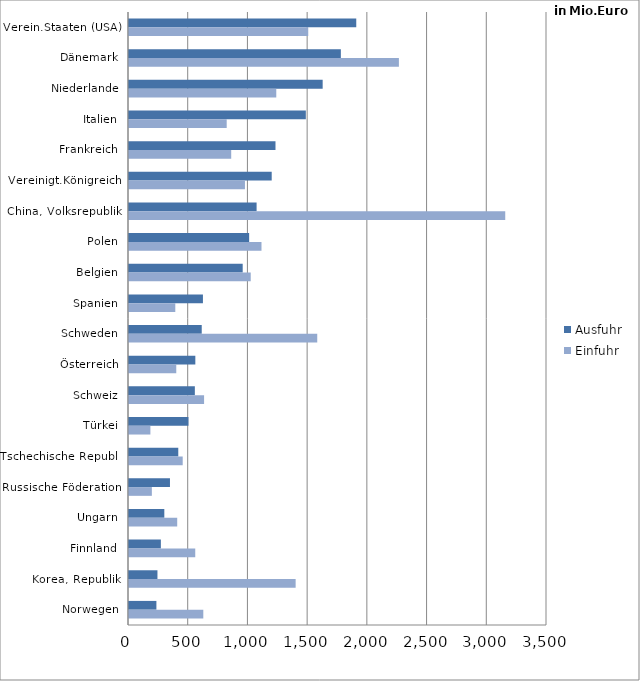
| Category | Ausfuhr | Einfuhr |
|---|---|---|
| Verein.Staaten (USA) | 1902.893 | 1500.786 |
| Dänemark | 1773.91 | 2259.923 |
| Niederlande | 1621.59 | 1233.15 |
| Italien | 1480.659 | 818.04 |
| Frankreich | 1226.59 | 855.825 |
| Vereinigt.Königreich | 1194.891 | 970.867 |
| China, Volksrepublik | 1068.472 | 3150.347 |
| Polen | 1006.036 | 1109.371 |
| Belgien | 952.022 | 1019.23 |
| Spanien | 619.037 | 387.643 |
| Schweden | 609.028 | 1576.155 |
| Österreich | 555.416 | 395.746 |
| Schweiz | 551.377 | 628.663 |
| Türkei | 497.971 | 179.114 |
| Tschechische Republ. | 412.59 | 449.705 |
| Russische Föderation | 343.036 | 191.391 |
| Ungarn | 295.734 | 403.655 |
| Finnland | 266.876 | 554.749 |
| Korea, Republik | 238.24 | 1395.29 |
| Norwegen | 229.481 | 622.134 |